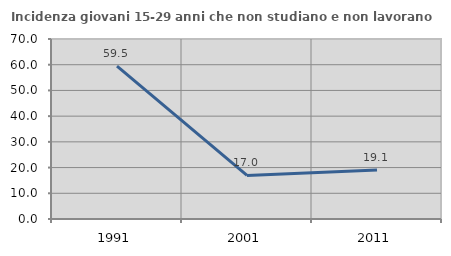
| Category | Incidenza giovani 15-29 anni che non studiano e non lavorano  |
|---|---|
| 1991.0 | 59.486 |
| 2001.0 | 16.962 |
| 2011.0 | 19.071 |